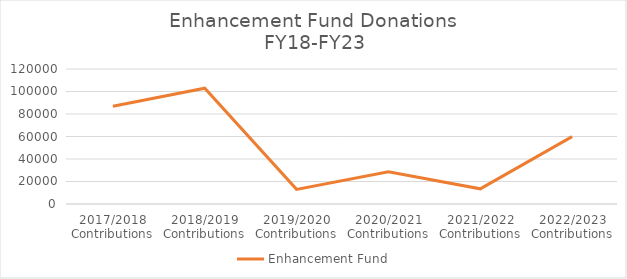
| Category | Series 0 | Enhancement Fund |
|---|---|---|
| 2017/2018 Contributions |  | 86849 |
| 2018/2019 Contributions |  | 102958.82 |
| 2019/2020 Contributions |  | 13011 |
| 2020/2021 Contributions |  | 28640.61 |
| 2021/2022 Contributions |  | 13489.27 |
| 2022/2023 Contributions |  | 59865.3 |